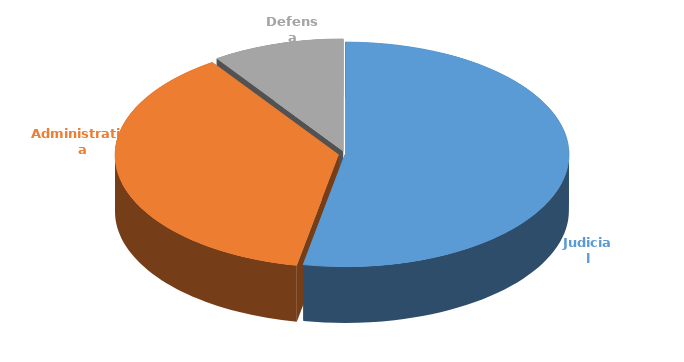
| Category | Cantidad |
|---|---|
| Judicial | 327 |
| Administrativa | 231 |
| Defensa | 59 |